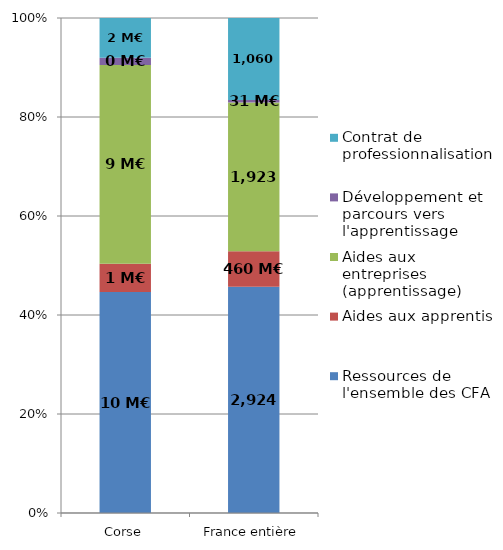
| Category | Ressources de l'ensemble des CFA | Aides aux apprentis | Aides aux entreprises (apprentissage) | Développement et parcours vers l'apprentissage | Contrat de professionnalisation |
|---|---|---|---|---|---|
| Corse | 9.769 | 1.255 | 8.791 | 0.319 | 1.76 |
| France entière | 2924.219 | 459.796 | 1923.184 | 31.421 | 1060.48 |